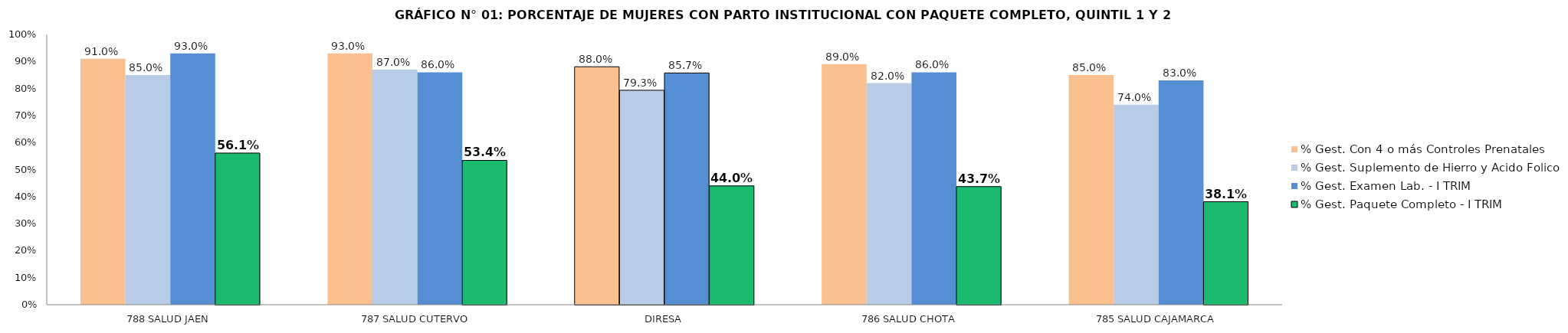
| Category | % Gest. Con 4 o más Controles Prenatales | % Gest. Suplemento de Hierro y Acido Folico | % Gest. Examen Lab. - I TRIM | % Gest. Paquete Completo - I TRIM |
|---|---|---|---|---|
| 788 SALUD JAEN | 0.91 | 0.85 | 0.93 | 0.561 |
| 787 SALUD CUTERVO | 0.93 | 0.87 | 0.86 | 0.534 |
| DIRESA | 0.88 | 0.793 | 0.857 | 0.44 |
| 786 SALUD CHOTA | 0.89 | 0.82 | 0.86 | 0.437 |
| 785 SALUD CAJAMARCA | 0.85 | 0.74 | 0.83 | 0.381 |